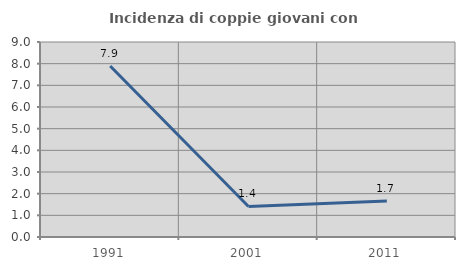
| Category | Incidenza di coppie giovani con figli |
|---|---|
| 1991.0 | 7.895 |
| 2001.0 | 1.408 |
| 2011.0 | 1.667 |